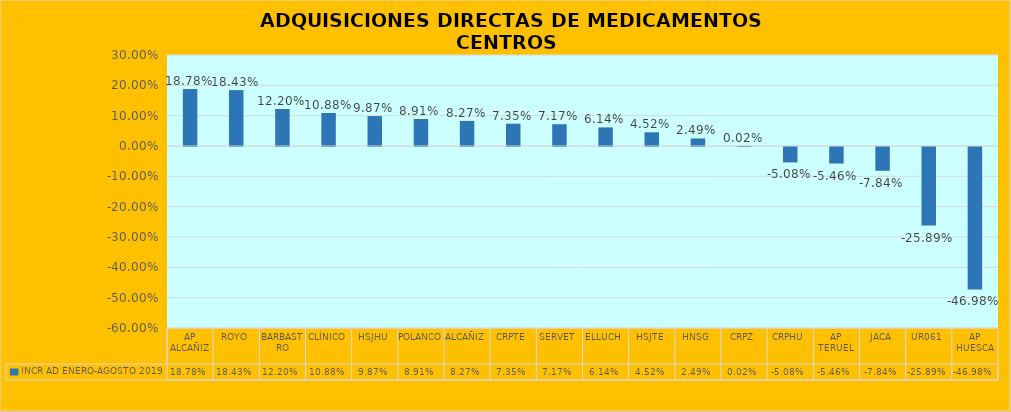
| Category | INCR AD ENERO-AGOSTO 2019 |
|---|---|
| AP ALCAÑIZ | 0.188 |
| ROYO | 0.184 |
| BARBASTRO | 0.122 |
| CLÍNICO | 0.109 |
| HSJHU | 0.099 |
| POLANCO | 0.089 |
| ALCAÑIZ | 0.083 |
| CRPTE | 0.074 |
| SERVET | 0.072 |
| ELLUCH | 0.061 |
| HSJTE | 0.045 |
| HNSG | 0.025 |
| CRPZ | 0 |
| CRPHU | -0.051 |
| AP TERUEL | -0.055 |
| JACA | -0.078 |
| UR061 | -0.259 |
| AP HUESCA | -0.47 |